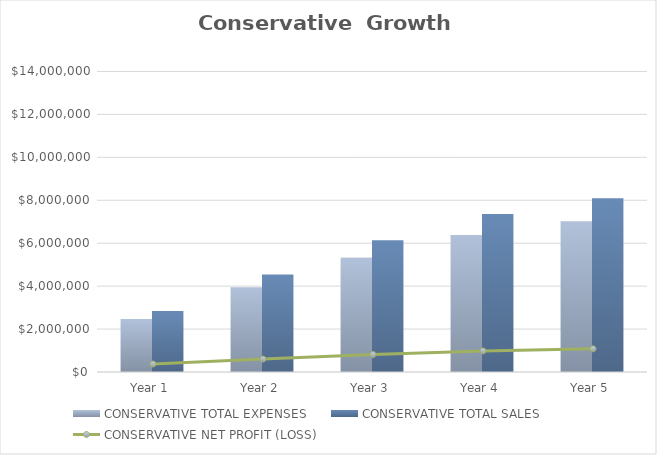
| Category | CONSERVATIVE TOTAL EXPENSES | CONSERVATIVE TOTAL SALES |
|---|---|---|
| Year 1 | 2467813.21 | 2840000 |
| Year 2 | 3942501.136 | 4544000 |
| Year 3 | 5318876.533 | 6134400 |
| Year 4 | 6380651.84 | 7361280 |
| Year 5 | 7017717.024 | 8097408 |